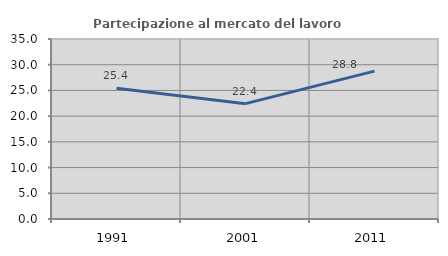
| Category | Partecipazione al mercato del lavoro  femminile |
|---|---|
| 1991.0 | 25.416 |
| 2001.0 | 22.431 |
| 2011.0 | 28.754 |